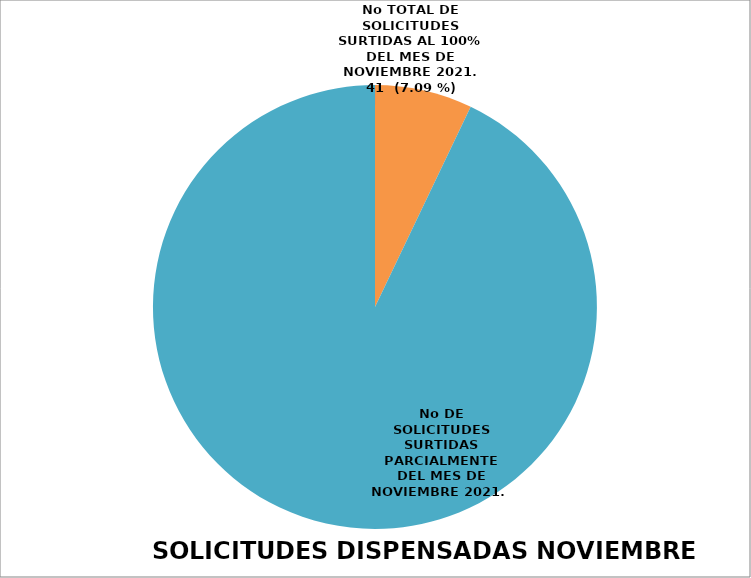
| Category | Series 0 |
|---|---|
| No TOTAL DE RECETAS SURTIDAS AL 100% DEL MES DE NOVIEMBRE 2021 | 41 |
| No DE RECETAS SURTIDAS PARCIALMENTE DEL MES DE  NOVIEMBRE 2021 | 537 |
| RECETAS NO SURTIDAS | 0 |